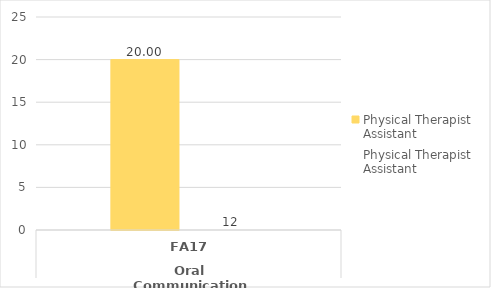
| Category | Average of outcome score - Physical Therapist Assistant | Count of outcome score - Physical Therapist Assistant |
|---|---|---|
| 0 | 20 | 12 |